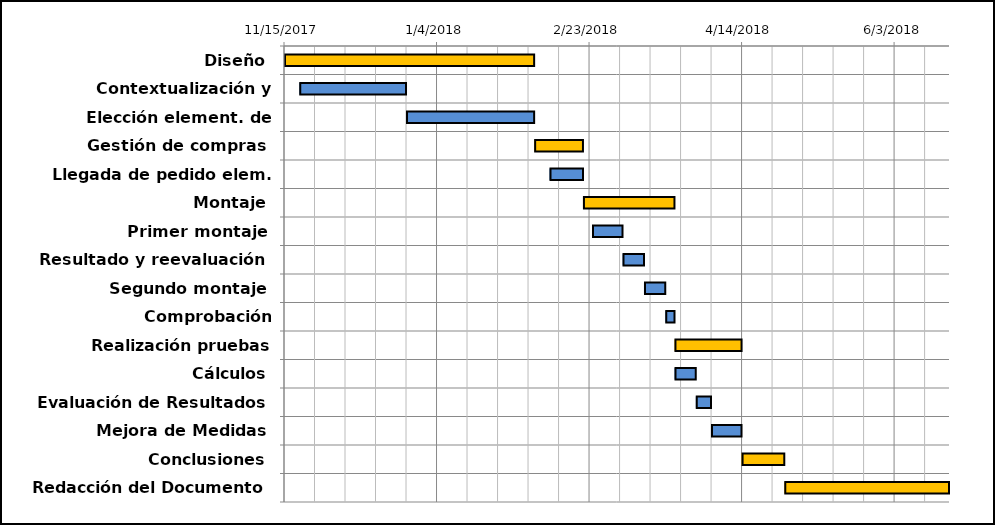
| Category | Fecha de Inicio | Duración |
|---|---|---|
| Diseño | 15/11/2017 | 82 |
|    Contextualización y Bocetos | 20/11/2017 | 35 |
|    Elección element. de instalac. | 25/12/2017 | 42 |
| Gestión de compras | 05/02/2018 | 16 |
|    Llegada de pedido elem. Eléct. | 10/02/2018 | 11 |
| Montaje | 21/02/2018 | 30 |
|    Primer montaje | 24/02/2018 | 10 |
|    Resultado y reevaluación | 06/03/2018 | 7 |
|    Segundo montaje | 13/03/2018 | 7 |
|    Comprobación funcionamiento | 20/03/2018 | 3 |
| Realización pruebas laboratorio | 23/03/2018 | 22 |
|    Cálculos | 23/03/2018 | 7 |
|    Evaluación de Resultados | 30/03/2018 | 5 |
|    Mejora de Medidas | 04/04/2018 | 10 |
| Conclusiones | 14/04/2018 | 14 |
| Redacción del Documento | 28/04/2018 | 54 |